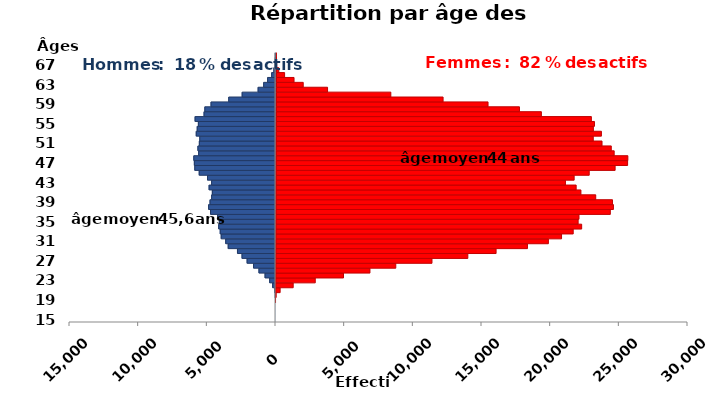
| Category | age | Homme | Femme |
|---|---|---|---|
| 15.0 | 15 | 0 | 0 |
| 16.0 | 16 | 0 | 0 |
| 17.0 | 17 | 0 | 0 |
| 18.0 | 18 | 0 | 0 |
| 19.0 | 19 | 0 | 4 |
| 20.0 | 20 | -11 | 59 |
| 21.0 | 21 | -42 | 353 |
| 22.0 | 22 | -206 | 1303 |
| 23.0 | 23 | -424 | 2908 |
| 24.0 | 24 | -760 | 4965 |
| 25.0 | 25 | -1203 | 6889 |
| 26.0 | 26 | -1597 | 8769 |
| 27.0 | 27 | -2067 | 11403 |
| 28.0 | 28 | -2436 | 14014 |
| 29.0 | 29 | -2769 | 16069 |
| 30.0 | 30 | -3443 | 18353 |
| 31.0 | 31 | -3624 | 19876 |
| 32.0 | 32 | -3952 | 20834 |
| 33.0 | 33 | -4025 | 21681 |
| 34.0 | 34 | -4135 | 22296 |
| 35.0 | 35 | -4087 | 22038 |
| 36.0 | 36 | -4218 | 22098 |
| 37.0 | 37 | -4730 | 24379 |
| 38.0 | 38 | -4870 | 24605 |
| 39.0 | 39 | -4767 | 24535 |
| 40.0 | 40 | -4648 | 23314 |
| 41.0 | 41 | -4598 | 22234 |
| 42.0 | 42 | -4834 | 21887 |
| 43.0 | 43 | -4650 | 21105 |
| 44.0 | 44 | -4950 | 21739 |
| 45.0 | 45 | -5554 | 22836 |
| 46.0 | 46 | -5876 | 24720 |
| 47.0 | 47 | -5908 | 25628 |
| 48.0 | 48 | -5947 | 25645 |
| 49.0 | 49 | -5595 | 24649 |
| 50.0 | 50 | -5648 | 24436 |
| 51.0 | 51 | -5545 | 23761 |
| 52.0 | 52 | -5512 | 23122 |
| 53.0 | 53 | -5770 | 23715 |
| 54.0 | 54 | -5699 | 23128 |
| 55.0 | 55 | -5615 | 23208 |
| 56.0 | 56 | -5854 | 22981 |
| 57.0 | 57 | -5202 | 19340 |
| 58.0 | 58 | -5144 | 17743 |
| 59.0 | 59 | -4693 | 15453 |
| 60.0 | 60 | -3404 | 12179 |
| 61.0 | 61 | -2426 | 8373 |
| 62.0 | 62 | -1265 | 3765 |
| 63.0 | 63 | -859 | 1992 |
| 64.0 | 64 | -574 | 1322 |
| 65.0 | 65 | -279 | 634 |
| 66.0 | 66 | -120 | 210 |
| 67.0 | 67 | -22 | 55 |
| 68.0 | 68 | -13 | 36 |
| 69.0 | 69 | -1 | 30 |